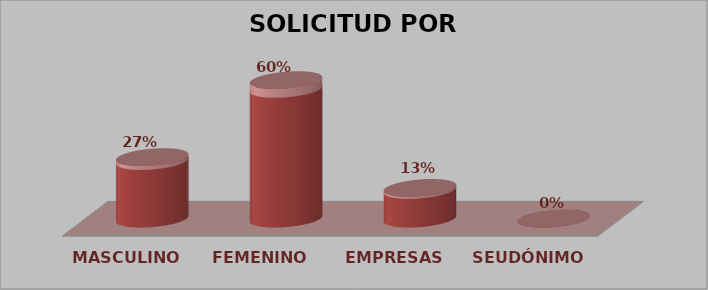
| Category | SOLICITUD POR SEXO | Series 1 |
|---|---|---|
| MASCULINO | 4 | 0.267 |
| FEMENINO | 9 | 0.6 |
| EMPRESAS | 2 | 0.133 |
| SEUDÓNIMO | 0 | 0 |